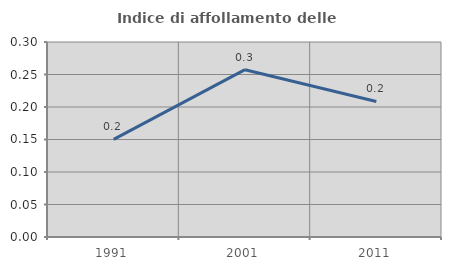
| Category | Indice di affollamento delle abitazioni  |
|---|---|
| 1991.0 | 0.15 |
| 2001.0 | 0.257 |
| 2011.0 | 0.209 |